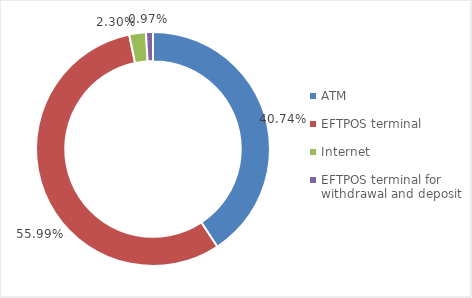
| Category | Series 0 |
|---|---|
| ATM | 11453581545 |
| EFTPOS terminal | 15740572487 |
| Internet | 645373076 |
| EFTPOS terminal for withdrawal and deposit | 272508202 |